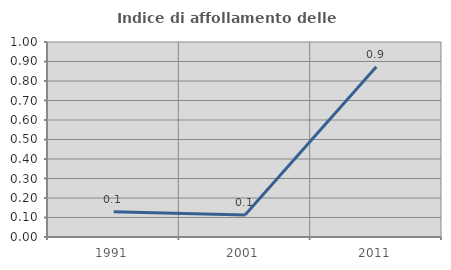
| Category | Indice di affollamento delle abitazioni  |
|---|---|
| 1991.0 | 0.129 |
| 2001.0 | 0.113 |
| 2011.0 | 0.873 |